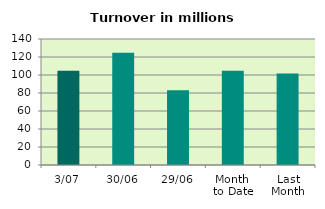
| Category | Series 0 |
|---|---|
| 3/07 | 104.61 |
| 30/06 | 124.686 |
| 29/06 | 83.193 |
| Month 
to Date | 104.61 |
| Last
Month | 101.544 |